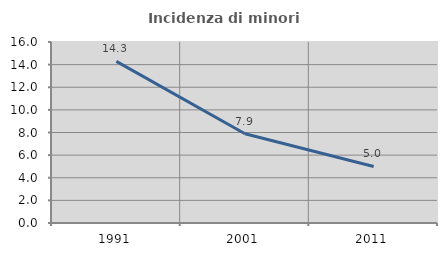
| Category | Incidenza di minori stranieri |
|---|---|
| 1991.0 | 14.286 |
| 2001.0 | 7.895 |
| 2011.0 | 5 |